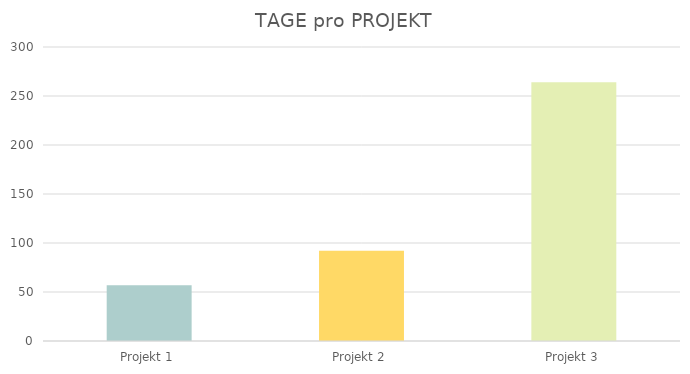
| Category | ANZAHL DER TAGE |
|---|---|
| Projekt 1 | 57 |
| Projekt 2 | 92 |
| Projekt 3 | 264 |